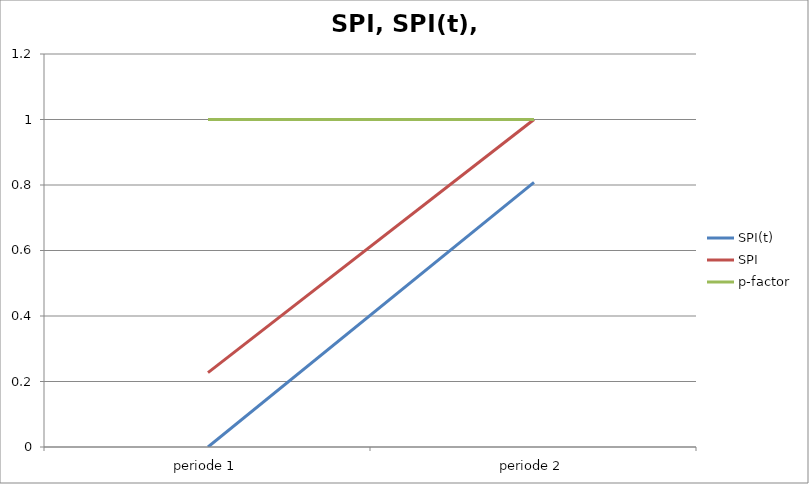
| Category | SPI(t) | SPI | p-factor |
|---|---|---|---|
| periode 1 | 0 | 0.227 | 1 |
| periode 2 | 0.808 | 1 | 1 |